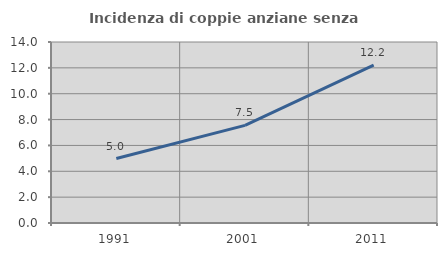
| Category | Incidenza di coppie anziane senza figli  |
|---|---|
| 1991.0 | 4.985 |
| 2001.0 | 7.55 |
| 2011.0 | 12.205 |